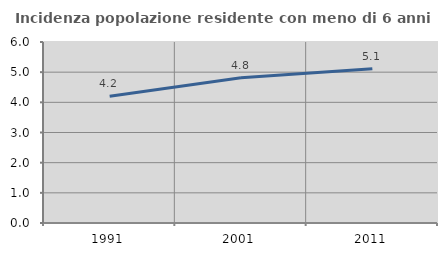
| Category | Incidenza popolazione residente con meno di 6 anni |
|---|---|
| 1991.0 | 4.199 |
| 2001.0 | 4.812 |
| 2011.0 | 5.117 |